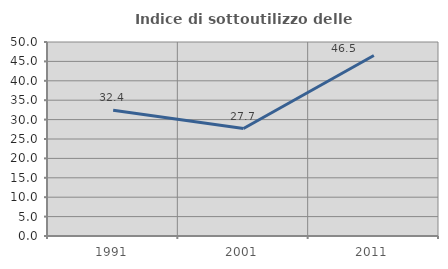
| Category | Indice di sottoutilizzo delle abitazioni  |
|---|---|
| 1991.0 | 32.386 |
| 2001.0 | 27.703 |
| 2011.0 | 46.528 |